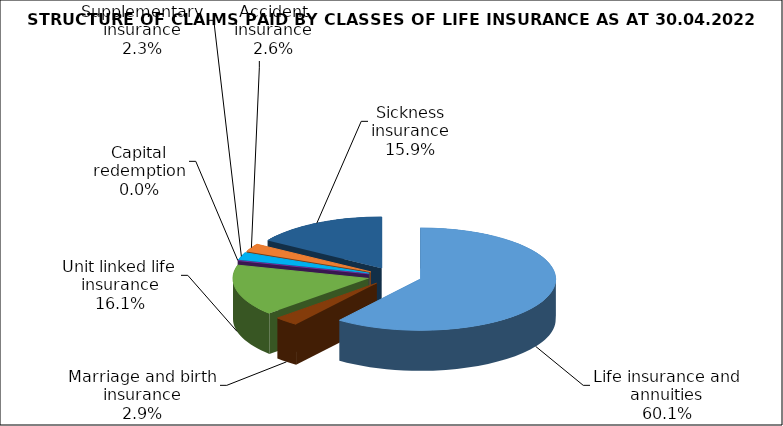
| Category | Series 0 |
|---|---|
| Life insurance and annuities | 54426065.977 |
| Marriage and birth insurance | 2639333.407 |
| Unit linked life insurance | 14606850.847 |
| Capital redemption | 0 |
| Supplementary insurance | 2124934.42 |
| Accident insurance | 2310578.938 |
| Sickness insurance | 14392529.936 |